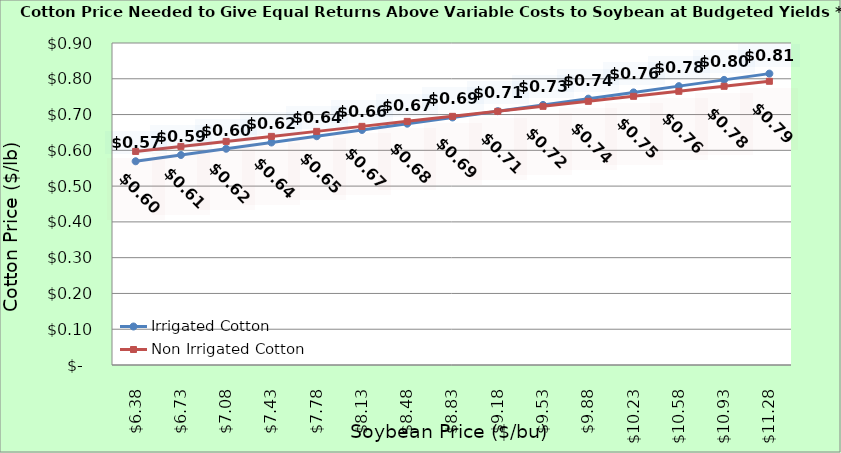
| Category | Irrigated Cotton | Non Irrigated Cotton |
|---|---|---|
| 6.380000000000003 | 0.569 | 0.597 |
| 6.730000000000002 | 0.587 | 0.611 |
| 7.080000000000002 | 0.604 | 0.625 |
| 7.4300000000000015 | 0.622 | 0.639 |
| 7.780000000000001 | 0.639 | 0.653 |
| 8.13 | 0.657 | 0.667 |
| 8.48 | 0.674 | 0.681 |
| 8.83 | 0.692 | 0.695 |
| 9.18 | 0.709 | 0.709 |
| 9.53 | 0.727 | 0.723 |
| 9.879999999999999 | 0.744 | 0.737 |
| 10.229999999999999 | 0.762 | 0.751 |
| 10.579999999999998 | 0.779 | 0.765 |
| 10.929999999999998 | 0.797 | 0.779 |
| 11.279999999999998 | 0.814 | 0.793 |